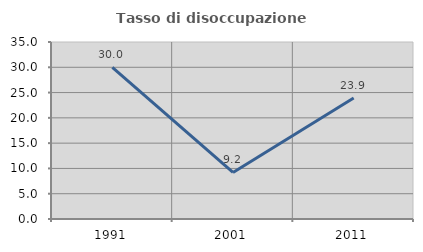
| Category | Tasso di disoccupazione giovanile  |
|---|---|
| 1991.0 | 30 |
| 2001.0 | 9.211 |
| 2011.0 | 23.913 |